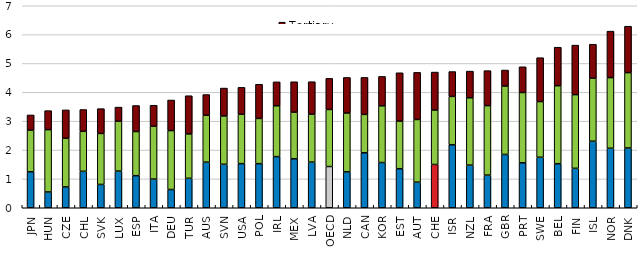
| Category | Primary | Secondary and post-secondary non-tertiary  | Tertiary |
|---|---|---|---|
| JPN | 1.246 | 1.447 | 0.524 |
| HUN | 0.547 | 2.159 | 0.659 |
| CZE | 0.723 | 1.686 | 0.983 |
| CHL | 1.263 | 1.386 | 0.755 |
| SVK | 0.808 | 1.767 | 0.86 |
| LUX | 1.271 | 1.729 | 0.489 |
| ESP | 1.111 | 1.529 | 0.903 |
| ITA | 0.995 | 1.831 | 0.727 |
| DEU | 0.632 | 2.043 | 1.059 |
| TUR | 1.021 | 1.539 | 1.323 |
| AUS | 1.58 | 1.627 | 0.716 |
| SVN | 1.507 | 1.677 | 0.964 |
| USA | 1.529 | 1.712 | 0.931 |
| POL | 1.528 | 1.567 | 1.184 |
| IRL | 1.772 | 1.762 | 0.828 |
| MEX | 1.697 | 1.617 | 1.053 |
| LVA | 1.582 | 1.663 | 1.123 |
| OECD | 1.428 | 1.978 | 1.078 |
| NLD | 1.243 | 2.04 | 1.231 |
| CAN | 1.905 | 1.331 | 1.28 |
| KOR | 1.567 | 1.966 | 1.018 |
| EST | 1.353 | 1.651 | 1.674 |
| AUT | 0.887 | 2.172 | 1.633 |
| CHE | 1.5 | 1.888 | 1.315 |
| ISR | 2.184 | 1.675 | 0.861 |
| NZL | 1.478 | 2.333 | 0.924 |
| FRA | 1.133 | 2.407 | 1.212 |
| GBR | 1.847 | 2.371 | 0.554 |
| PRT | 1.559 | 2.435 | 0.892 |
| SWE | 1.75 | 1.931 | 1.52 |
| BEL | 1.526 | 2.703 | 1.334 |
| FIN | 1.367 | 2.552 | 1.717 |
| ISL | 2.306 | 2.185 | 1.176 |
| NOR | 2.061 | 2.448 | 1.611 |
| DNK | 2.072 | 2.612 | 1.608 |